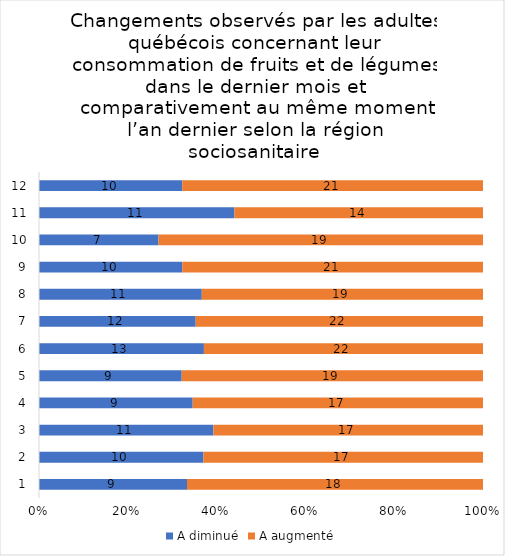
| Category | A diminué | A augmenté |
|---|---|---|
| 0 | 9 | 18 |
| 1 | 10 | 17 |
| 2 | 11 | 17 |
| 3 | 9 | 17 |
| 4 | 9 | 19 |
| 5 | 13 | 22 |
| 6 | 12 | 22 |
| 7 | 11 | 19 |
| 8 | 10 | 21 |
| 9 | 7 | 19 |
| 10 | 11 | 14 |
| 11 | 10 | 21 |